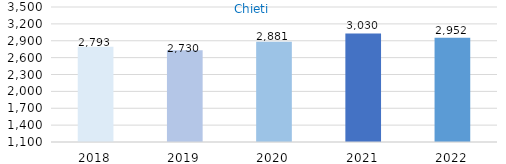
| Category | Series 0 |
|---|---|
| 2018.0 | 2793 |
| 2019.0 | 2730 |
| 2020.0 | 2881 |
| 2021.0 | 3030 |
| 2022.0 | 2952 |